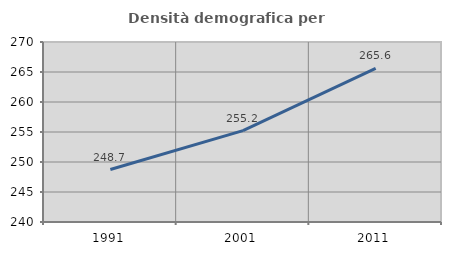
| Category | Densità demografica |
|---|---|
| 1991.0 | 248.741 |
| 2001.0 | 255.237 |
| 2011.0 | 265.593 |